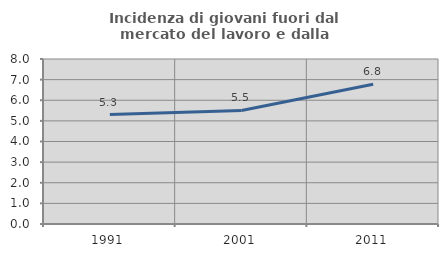
| Category | Incidenza di giovani fuori dal mercato del lavoro e dalla formazione  |
|---|---|
| 1991.0 | 5.304 |
| 2001.0 | 5.506 |
| 2011.0 | 6.773 |